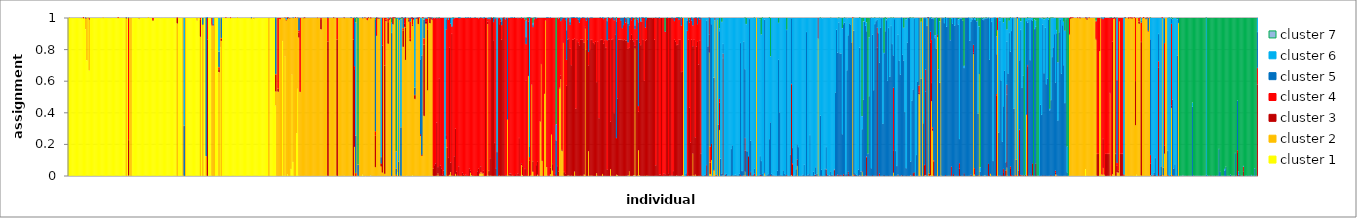
| Category | cluster 1 | cluster 2 | cluster 3 | cluster 4 | cluster 5 | cluster 6 | cluster 7 |
|---|---|---|---|---|---|---|---|
| 0 | 1 | 0 | 0 | 0 | 0 | 0 | 0 |
| 1 | 0.999 | 0.001 | 0 | 0 | 0 | 0 | 0 |
| 2 | 1 | 0 | 0 | 0 | 0 | 0 | 0 |
| 3 | 1 | 0 | 0 | 0 | 0 | 0 | 0 |
| 4 | 1 | 0 | 0 | 0 | 0 | 0 | 0 |
| 5 | 1 | 0 | 0 | 0 | 0 | 0 | 0 |
| 6 | 1 | 0 | 0 | 0 | 0 | 0 | 0 |
| 7 | 1 | 0 | 0 | 0 | 0 | 0 | 0 |
| 8 | 1 | 0 | 0 | 0 | 0 | 0 | 0 |
| 9 | 1 | 0 | 0 | 0 | 0 | 0 | 0 |
| 10 | 1 | 0 | 0 | 0 | 0 | 0 | 0 |
| 11 | 0.997 | 0.003 | 0 | 0 | 0 | 0 | 0 |
| 12 | 1 | 0 | 0 | 0 | 0 | 0 | 0 |
| 13 | 0.997 | 0.001 | 0.002 | 0 | 0 | 0 | 0 |
| 14 | 1 | 0 | 0 | 0 | 0 | 0 | 0 |
| 15 | 0.927 | 0.067 | 0 | 0.005 | 0.001 | 0 | 0 |
| 16 | 0.731 | 0.269 | 0 | 0 | 0 | 0 | 0 |
| 17 | 0.999 | 0.001 | 0 | 0 | 0 | 0 | 0 |
| 18 | 0.666 | 0.322 | 0.006 | 0.005 | 0 | 0 | 0 |
| 19 | 1 | 0 | 0 | 0 | 0 | 0 | 0 |
| 20 | 1 | 0 | 0 | 0 | 0 | 0 | 0 |
| 21 | 1 | 0 | 0 | 0 | 0 | 0 | 0 |
| 22 | 1 | 0 | 0 | 0 | 0 | 0 | 0 |
| 23 | 1 | 0 | 0 | 0 | 0 | 0 | 0 |
| 24 | 1 | 0 | 0 | 0 | 0 | 0 | 0 |
| 25 | 1 | 0 | 0 | 0 | 0 | 0 | 0 |
| 26 | 1 | 0 | 0 | 0 | 0 | 0 | 0 |
| 27 | 1 | 0 | 0 | 0 | 0 | 0 | 0 |
| 28 | 1 | 0 | 0 | 0 | 0 | 0 | 0 |
| 29 | 1 | 0 | 0 | 0 | 0 | 0 | 0 |
| 30 | 0.999 | 0.001 | 0 | 0 | 0 | 0 | 0 |
| 31 | 1 | 0 | 0 | 0 | 0 | 0 | 0 |
| 32 | 1 | 0 | 0 | 0 | 0 | 0 | 0 |
| 33 | 1 | 0 | 0 | 0 | 0 | 0 | 0 |
| 34 | 1 | 0 | 0 | 0 | 0 | 0 | 0 |
| 35 | 1 | 0 | 0 | 0 | 0 | 0 | 0 |
| 36 | 1 | 0 | 0 | 0 | 0 | 0 | 0 |
| 37 | 1 | 0 | 0 | 0 | 0 | 0 | 0 |
| 38 | 1 | 0 | 0 | 0 | 0 | 0 | 0 |
| 39 | 1 | 0 | 0 | 0 | 0 | 0 | 0 |
| 40 | 1 | 0 | 0 | 0 | 0 | 0 | 0 |
| 41 | 1 | 0 | 0 | 0 | 0 | 0 | 0 |
| 42 | 1 | 0 | 0 | 0 | 0 | 0 | 0 |
| 43 | 0.999 | 0.001 | 0 | 0 | 0 | 0 | 0 |
| 44 | 1 | 0 | 0 | 0 | 0 | 0 | 0 |
| 45 | 1 | 0 | 0 | 0 | 0 | 0 | 0 |
| 46 | 1 | 0 | 0 | 0 | 0 | 0 | 0 |
| 47 | 1 | 0 | 0 | 0 | 0 | 0 | 0 |
| 48 | 1 | 0 | 0 | 0 | 0 | 0 | 0 |
| 49 | 1 | 0 | 0 | 0 | 0 | 0 | 0 |
| 50 | 0 | 0.996 | 0.003 | 0 | 0 | 0.001 | 0 |
| 51 | 1 | 0 | 0 | 0 | 0 | 0 | 0 |
| 52 | 0 | 0.002 | 0.224 | 0.772 | 0.002 | 0 | 0 |
| 53 | 1 | 0 | 0 | 0 | 0 | 0 | 0 |
| 54 | 0 | 1 | 0 | 0 | 0 | 0 | 0 |
| 55 | 1 | 0 | 0 | 0 | 0 | 0 | 0 |
| 56 | 1 | 0 | 0 | 0 | 0 | 0 | 0 |
| 57 | 1 | 0 | 0 | 0 | 0 | 0 | 0 |
| 58 | 1 | 0 | 0 | 0 | 0 | 0 | 0 |
| 59 | 1 | 0 | 0 | 0 | 0 | 0 | 0 |
| 60 | 1 | 0 | 0 | 0 | 0 | 0 | 0 |
| 61 | 0.99 | 0.01 | 0 | 0 | 0 | 0 | 0 |
| 62 | 1 | 0 | 0 | 0 | 0 | 0 | 0 |
| 63 | 1 | 0 | 0 | 0 | 0 | 0 | 0 |
| 64 | 1 | 0 | 0 | 0 | 0 | 0 | 0 |
| 65 | 1 | 0 | 0 | 0 | 0 | 0 | 0 |
| 66 | 1 | 0 | 0 | 0 | 0 | 0 | 0 |
| 67 | 1 | 0 | 0 | 0 | 0 | 0 | 0 |
| 68 | 1 | 0 | 0 | 0 | 0 | 0 | 0 |
| 69 | 1 | 0 | 0 | 0 | 0 | 0 | 0 |
| 70 | 1 | 0 | 0 | 0 | 0 | 0 | 0 |
| 71 | 1 | 0 | 0 | 0 | 0 | 0 | 0 |
| 72 | 1 | 0 | 0 | 0 | 0 | 0 | 0 |
| 73 | 0.985 | 0 | 0 | 0.015 | 0 | 0 | 0 |
| 74 | 1 | 0 | 0 | 0 | 0 | 0 | 0 |
| 75 | 1 | 0 | 0 | 0 | 0 | 0 | 0 |
| 76 | 1 | 0 | 0 | 0 | 0 | 0 | 0 |
| 77 | 1 | 0 | 0 | 0 | 0 | 0 | 0 |
| 78 | 1 | 0 | 0 | 0 | 0 | 0 | 0 |
| 79 | 1 | 0 | 0 | 0 | 0 | 0 | 0 |
| 80 | 1 | 0 | 0 | 0 | 0 | 0 | 0 |
| 81 | 1 | 0 | 0 | 0 | 0 | 0 | 0 |
| 82 | 1 | 0 | 0 | 0 | 0 | 0 | 0 |
| 83 | 1 | 0 | 0 | 0 | 0 | 0 | 0 |
| 84 | 1 | 0 | 0 | 0 | 0 | 0 | 0 |
| 85 | 1 | 0 | 0 | 0 | 0 | 0 | 0 |
| 86 | 1 | 0 | 0 | 0 | 0 | 0 | 0 |
| 87 | 1 | 0 | 0 | 0 | 0 | 0 | 0 |
| 88 | 1 | 0 | 0 | 0 | 0 | 0 | 0 |
| 89 | 1 | 0 | 0 | 0 | 0 | 0 | 0 |
| 90 | 1 | 0 | 0 | 0 | 0 | 0 | 0 |
| 91 | 1 | 0 | 0 | 0 | 0 | 0 | 0 |
| 92 | 1 | 0 | 0 | 0 | 0 | 0 | 0 |
| 93 | 1 | 0 | 0 | 0 | 0 | 0 | 0 |
| 94 | 0 | 0.964 | 0.035 | 0.001 | 0 | 0 | 0 |
| 95 | 1 | 0 | 0 | 0 | 0 | 0 | 0 |
| 96 | 1 | 0 | 0 | 0 | 0 | 0 | 0 |
| 97 | 1 | 0 | 0 | 0 | 0 | 0 | 0 |
| 98 | 1 | 0 | 0 | 0 | 0 | 0 | 0 |
| 99 | 0 | 1 | 0 | 0 | 0 | 0 | 0 |
| 100 | 0 | 0 | 0 | 0 | 0.316 | 0.684 | 0 |
| 101 | 0 | 1 | 0 | 0 | 0 | 0 | 0 |
| 102 | 1 | 0 | 0 | 0 | 0 | 0 | 0 |
| 103 | 1 | 0 | 0 | 0 | 0 | 0 | 0 |
| 104 | 1 | 0 | 0 | 0 | 0 | 0 | 0 |
| 105 | 1 | 0 | 0 | 0 | 0 | 0 | 0 |
| 106 | 1 | 0 | 0 | 0 | 0 | 0 | 0 |
| 107 | 1 | 0 | 0 | 0 | 0 | 0 | 0 |
| 108 | 1 | 0 | 0 | 0 | 0 | 0 | 0 |
| 109 | 1 | 0 | 0 | 0 | 0 | 0 | 0 |
| 110 | 1 | 0 | 0 | 0 | 0 | 0 | 0 |
| 111 | 0.981 | 0.019 | 0 | 0 | 0 | 0 | 0 |
| 112 | 1 | 0 | 0 | 0 | 0 | 0 | 0 |
| 113 | 1 | 0 | 0 | 0 | 0 | 0 | 0 |
| 114 | 0 | 0.88 | 0.107 | 0.013 | 0 | 0 | 0 |
| 115 | 1 | 0 | 0 | 0 | 0 | 0 | 0 |
| 116 | 0 | 0.956 | 0 | 0.001 | 0.043 | 0 | 0 |
| 117 | 1 | 0 | 0 | 0 | 0 | 0 | 0 |
| 118 | 1 | 0 | 0 | 0 | 0 | 0 | 0 |
| 119 | 0 | 0.124 | 0 | 0 | 0.876 | 0 | 0 |
| 120 | 0 | 0 | 0.863 | 0.137 | 0 | 0 | 0 |
| 121 | 1 | 0 | 0 | 0 | 0 | 0 | 0 |
| 122 | 1 | 0 | 0 | 0 | 0 | 0 | 0 |
| 123 | 1 | 0 | 0 | 0 | 0 | 0 | 0 |
| 124 | 0 | 0.952 | 0.002 | 0.046 | 0 | 0 | 0 |
| 125 | 0 | 0.95 | 0.003 | 0 | 0.008 | 0.04 | 0 |
| 126 | 0 | 1 | 0 | 0 | 0 | 0 | 0 |
| 127 | 1 | 0 | 0 | 0 | 0 | 0 | 0 |
| 128 | 1 | 0 | 0 | 0 | 0 | 0 | 0 |
| 129 | 1 | 0 | 0 | 0 | 0 | 0 | 0 |
| 130 | 0 | 0.655 | 0.02 | 0.012 | 0.099 | 0.214 | 0 |
| 131 | 0.814 | 0.186 | 0 | 0 | 0 | 0 | 0 |
| 132 | 0 | 0.854 | 0.013 | 0.005 | 0.126 | 0.002 | 0 |
| 133 | 1 | 0 | 0 | 0 | 0 | 0 | 0 |
| 134 | 1 | 0 | 0 | 0 | 0 | 0 | 0 |
| 135 | 1 | 0 | 0 | 0 | 0 | 0 | 0 |
| 136 | 1 | 0 | 0 | 0 | 0 | 0 | 0 |
| 137 | 1 | 0 | 0 | 0 | 0 | 0 | 0 |
| 138 | 1 | 0 | 0 | 0 | 0 | 0 | 0 |
| 139 | 1 | 0 | 0 | 0 | 0 | 0 | 0 |
| 140 | 0.999 | 0 | 0 | 0.001 | 0 | 0 | 0 |
| 141 | 1 | 0 | 0 | 0 | 0 | 0 | 0 |
| 142 | 1 | 0 | 0 | 0 | 0 | 0 | 0 |
| 143 | 1 | 0 | 0 | 0 | 0 | 0 | 0 |
| 144 | 1 | 0 | 0 | 0 | 0 | 0 | 0 |
| 145 | 1 | 0 | 0 | 0 | 0 | 0 | 0 |
| 146 | 0.999 | 0.001 | 0 | 0 | 0 | 0 | 0 |
| 147 | 1 | 0 | 0 | 0 | 0 | 0 | 0 |
| 148 | 1 | 0 | 0 | 0 | 0 | 0 | 0 |
| 149 | 1 | 0 | 0 | 0 | 0 | 0 | 0 |
| 150 | 1 | 0 | 0 | 0 | 0 | 0 | 0 |
| 151 | 1 | 0 | 0 | 0 | 0 | 0 | 0 |
| 152 | 1 | 0 | 0 | 0 | 0 | 0 | 0 |
| 153 | 1 | 0 | 0 | 0 | 0 | 0 | 0 |
| 154 | 1 | 0 | 0 | 0 | 0 | 0 | 0 |
| 155 | 1 | 0 | 0 | 0 | 0 | 0 | 0 |
| 156 | 1 | 0 | 0 | 0 | 0 | 0 | 0 |
| 157 | 1 | 0 | 0 | 0 | 0 | 0 | 0 |
| 158 | 0.99 | 0.009 | 0 | 0 | 0.001 | 0 | 0 |
| 159 | 1 | 0 | 0 | 0 | 0 | 0 | 0 |
| 160 | 0.99 | 0.01 | 0 | 0 | 0 | 0 | 0 |
| 161 | 1 | 0 | 0 | 0 | 0 | 0 | 0 |
| 162 | 1 | 0 | 0 | 0 | 0 | 0 | 0 |
| 163 | 1 | 0 | 0 | 0 | 0 | 0 | 0 |
| 164 | 1 | 0 | 0 | 0 | 0 | 0 | 0 |
| 165 | 1 | 0 | 0 | 0 | 0 | 0 | 0 |
| 166 | 1 | 0 | 0 | 0 | 0 | 0 | 0 |
| 167 | 1 | 0 | 0 | 0 | 0 | 0 | 0 |
| 168 | 1 | 0 | 0 | 0 | 0 | 0 | 0 |
| 169 | 1 | 0 | 0 | 0 | 0 | 0 | 0 |
| 170 | 1 | 0 | 0 | 0 | 0 | 0 | 0 |
| 171 | 1 | 0 | 0 | 0 | 0 | 0 | 0 |
| 172 | 1 | 0 | 0 | 0 | 0 | 0 | 0 |
| 173 | 0 | 1 | 0 | 0 | 0 | 0 | 0 |
| 174 | 1 | 0 | 0 | 0 | 0 | 0 | 0 |
| 175 | 1 | 0 | 0 | 0 | 0 | 0 | 0 |
| 176 | 1 | 0 | 0 | 0 | 0 | 0 | 0 |
| 177 | 1 | 0 | 0 | 0 | 0 | 0 | 0 |
| 178 | 1 | 0 | 0 | 0 | 0 | 0 | 0 |
| 179 | 0.444 | 0.089 | 0.108 | 0.002 | 0.356 | 0.001 | 0 |
| 180 | 0 | 1 | 0 | 0 | 0 | 0 | 0 |
| 181 | 0 | 0.532 | 0.018 | 0.45 | 0 | 0 | 0 |
| 182 | 0 | 0.993 | 0.001 | 0.006 | 0 | 0 | 0 |
| 183 | 0 | 0.993 | 0 | 0.007 | 0 | 0 | 0 |
| 184 | 0 | 1 | 0 | 0 | 0 | 0 | 0 |
| 185 | 0.852 | 0.148 | 0 | 0 | 0 | 0 | 0 |
| 186 | 0.001 | 0.999 | 0 | 0 | 0 | 0 | 0 |
| 187 | 0.757 | 0.242 | 0.002 | 0 | 0 | 0 | 0 |
| 188 | 0 | 0.984 | 0.002 | 0.002 | 0 | 0.012 | 0 |
| 189 | 0.01 | 0.983 | 0.007 | 0 | 0 | 0 | 0 |
| 190 | 0.001 | 0.998 | 0 | 0 | 0.001 | 0 | 0 |
| 191 | 0 | 0.995 | 0 | 0.005 | 0 | 0 | 0 |
| 192 | 0.042 | 0.958 | 0 | 0 | 0 | 0 | 0 |
| 193 | 0.641 | 0.359 | 0 | 0 | 0 | 0 | 0 |
| 194 | 0.086 | 0.913 | 0 | 0 | 0.001 | 0 | 0 |
| 195 | 0 | 1 | 0 | 0 | 0 | 0 | 0 |
| 196 | 0 | 1 | 0 | 0 | 0 | 0 | 0 |
| 197 | 0.269 | 0.731 | 0 | 0 | 0 | 0 | 0 |
| 198 | 0.55 | 0.448 | 0 | 0.002 | 0 | 0 | 0 |
| 199 | 0.001 | 0.874 | 0.032 | 0.012 | 0.079 | 0.002 | 0 |
| 200 | 0 | 0.531 | 0.001 | 0.468 | 0 | 0 | 0 |
| 201 | 0 | 1 | 0 | 0 | 0 | 0 | 0 |
| 202 | 0 | 1 | 0 | 0 | 0 | 0 | 0 |
| 203 | 0 | 0.997 | 0 | 0.003 | 0 | 0 | 0 |
| 204 | 0 | 0.999 | 0.001 | 0 | 0 | 0 | 0 |
| 205 | 0 | 1 | 0 | 0 | 0 | 0 | 0 |
| 206 | 0 | 1 | 0 | 0 | 0 | 0 | 0 |
| 207 | 0 | 1 | 0 | 0 | 0 | 0 | 0 |
| 208 | 0 | 1 | 0 | 0 | 0 | 0 | 0 |
| 209 | 0 | 1 | 0 | 0 | 0 | 0 | 0 |
| 210 | 0 | 1 | 0 | 0 | 0 | 0 | 0 |
| 211 | 0 | 1 | 0 | 0 | 0 | 0 | 0 |
| 212 | 0 | 1 | 0 | 0 | 0 | 0 | 0 |
| 213 | 0 | 1 | 0 | 0 | 0 | 0 | 0 |
| 214 | 0 | 1 | 0 | 0 | 0 | 0 | 0 |
| 215 | 0 | 0.998 | 0 | 0.002 | 0 | 0 | 0 |
| 216 | 0 | 1 | 0 | 0 | 0 | 0 | 0 |
| 217 | 0 | 1 | 0 | 0 | 0 | 0 | 0 |
| 218 | 0 | 0.926 | 0.066 | 0.008 | 0 | 0 | 0 |
| 219 | 0 | 1 | 0 | 0 | 0 | 0 | 0 |
| 220 | 0 | 1 | 0 | 0 | 0 | 0 | 0 |
| 221 | 0 | 1 | 0 | 0 | 0 | 0 | 0 |
| 222 | 0 | 1 | 0 | 0 | 0 | 0 | 0 |
| 223 | 0 | 1 | 0 | 0 | 0 | 0 | 0 |
| 224 | 0 | 0 | 0.851 | 0.148 | 0.001 | 0 | 0 |
| 225 | 0 | 1 | 0 | 0 | 0 | 0 | 0 |
| 226 | 0 | 1 | 0 | 0 | 0 | 0 | 0 |
| 227 | 0 | 1 | 0 | 0 | 0 | 0 | 0 |
| 228 | 0 | 1 | 0 | 0 | 0 | 0 | 0 |
| 229 | 0 | 0.999 | 0.001 | 0 | 0 | 0 | 0 |
| 230 | 0 | 1 | 0 | 0 | 0 | 0 | 0 |
| 231 | 0 | 1 | 0 | 0 | 0 | 0 | 0 |
| 232 | 0 | 0 | 0.862 | 0.138 | 0 | 0 | 0 |
| 233 | 0 | 1 | 0 | 0 | 0 | 0 | 0 |
| 234 | 0.001 | 0.999 | 0 | 0 | 0 | 0 | 0 |
| 235 | 0 | 1 | 0 | 0 | 0 | 0 | 0 |
| 236 | 0 | 1 | 0 | 0 | 0 | 0 | 0 |
| 237 | 0 | 1 | 0 | 0 | 0 | 0 | 0 |
| 238 | 0.002 | 0.997 | 0.001 | 0 | 0 | 0 | 0 |
| 239 | 0 | 1 | 0 | 0 | 0 | 0 | 0 |
| 240 | 0 | 1 | 0 | 0 | 0 | 0 | 0 |
| 241 | 0 | 1 | 0 | 0 | 0 | 0 | 0 |
| 242 | 0 | 1 | 0 | 0 | 0 | 0 | 0 |
| 243 | 0 | 1 | 0 | 0 | 0 | 0 | 0 |
| 244 | 0 | 1 | 0 | 0 | 0 | 0 | 0 |
| 245 | 0 | 1 | 0 | 0 | 0 | 0 | 0 |
| 246 | 0 | 0 | 0.861 | 0.139 | 0 | 0 | 0 |
| 247 | 0 | 0.183 | 0.492 | 0.019 | 0.304 | 0 | 0.002 |
| 248 | 0 | 0 | 0.001 | 0.016 | 0.237 | 0.715 | 0.031 |
| 249 | 0 | 1 | 0 | 0 | 0 | 0 | 0 |
| 250 | 0 | 0 | 0 | 0 | 0.07 | 0 | 0.93 |
| 251 | 0 | 1 | 0 | 0 | 0 | 0 | 0 |
| 252 | 0 | 1 | 0 | 0 | 0 | 0 | 0 |
| 253 | 0 | 1 | 0 | 0 | 0 | 0 | 0 |
| 254 | 0.006 | 0.99 | 0 | 0.003 | 0.001 | 0 | 0 |
| 255 | 0 | 1 | 0 | 0 | 0 | 0 | 0 |
| 256 | 0 | 0.999 | 0.001 | 0 | 0 | 0 | 0 |
| 257 | 0 | 1 | 0 | 0 | 0 | 0 | 0 |
| 258 | 0 | 0.985 | 0 | 0.015 | 0 | 0 | 0 |
| 259 | 0 | 0.999 | 0.001 | 0 | 0 | 0 | 0 |
| 260 | 0 | 1 | 0 | 0 | 0 | 0 | 0 |
| 261 | 0.003 | 0.994 | 0.002 | 0.001 | 0 | 0 | 0 |
| 262 | 0 | 1 | 0 | 0 | 0 | 0 | 0 |
| 263 | 0 | 1 | 0 | 0 | 0 | 0 | 0 |
| 264 | 0 | 1 | 0 | 0 | 0 | 0 | 0 |
| 265 | 0 | 0.054 | 0.202 | 0.026 | 0.71 | 0 | 0.008 |
| 266 | 0 | 0.888 | 0.001 | 0.111 | 0 | 0 | 0 |
| 267 | 0 | 0.997 | 0.001 | 0.002 | 0 | 0 | 0 |
| 268 | 0 | 0.996 | 0 | 0 | 0.004 | 0 | 0 |
| 269 | 0 | 1 | 0 | 0 | 0 | 0 | 0 |
| 270 | 0 | 0.058 | 0.018 | 0 | 0.041 | 0.882 | 0 |
| 271 | 0 | 0.02 | 0.804 | 0.176 | 0 | 0 | 0 |
| 272 | 0 | 1 | 0 | 0 | 0 | 0 | 0 |
| 273 | 0 | 0.013 | 0.685 | 0.302 | 0 | 0 | 0 |
| 274 | 0 | 0.978 | 0.01 | 0.012 | 0 | 0 | 0 |
| 275 | 0 | 1 | 0 | 0 | 0 | 0 | 0 |
| 276 | 0 | 0.836 | 0.137 | 0.022 | 0.004 | 0.001 | 0 |
| 277 | 0 | 0.987 | 0.01 | 0.003 | 0 | 0 | 0 |
| 278 | 0 | 0.996 | 0.002 | 0.002 | 0 | 0 | 0 |
| 279 | 0 | 0 | 0 | 0 | 0.904 | 0.064 | 0.032 |
| 280 | 0 | 0.958 | 0.041 | 0.001 | 0 | 0 | 0 |
| 281 | 0 | 0.998 | 0.002 | 0 | 0 | 0 | 0 |
| 282 | 0 | 0.998 | 0 | 0.001 | 0.001 | 0 | 0 |
| 283 | 0 | 0 | 0 | 0.005 | 0.041 | 0.107 | 0.847 |
| 284 | 0.021 | 0.974 | 0 | 0 | 0.005 | 0 | 0 |
| 285 | 0 | 0 | 0 | 0.001 | 0.088 | 0.911 | 0 |
| 286 | 0 | 0.986 | 0.003 | 0 | 0.011 | 0 | 0 |
| 287 | 0 | 0 | 0 | 0 | 0.306 | 0.685 | 0.009 |
| 288 | 0 | 1 | 0 | 0 | 0 | 0 | 0 |
| 289 | 0 | 0.816 | 0.105 | 0.014 | 0.066 | 0 | 0 |
| 290 | 0 | 0.943 | 0.019 | 0.036 | 0.002 | 0 | 0 |
| 291 | 0 | 0.733 | 0.205 | 0.061 | 0 | 0 | 0 |
| 292 | 0.001 | 0.996 | 0 | 0 | 0.003 | 0 | 0 |
| 293 | 0 | 1 | 0 | 0 | 0 | 0 | 0 |
| 294 | 0 | 0.974 | 0.017 | 0.009 | 0 | 0 | 0 |
| 295 | 0 | 0.851 | 0.015 | 0.11 | 0.024 | 0 | 0 |
| 296 | 0 | 0.994 | 0.005 | 0.001 | 0 | 0 | 0 |
| 297 | 0.004 | 0.945 | 0.007 | 0.044 | 0 | 0 | 0 |
| 298 | 0 | 0.988 | 0.012 | 0 | 0 | 0 | 0 |
| 299 | 0 | 0.486 | 0.024 | 0.001 | 0.046 | 0.442 | 0 |
| 300 | 0 | 0.994 | 0.002 | 0 | 0.004 | 0 | 0 |
| 301 | 0 | 0.995 | 0.001 | 0.003 | 0.001 | 0 | 0 |
| 302 | 0 | 0.96 | 0.04 | 0.001 | 0 | 0 | 0 |
| 303 | 0 | 0.999 | 0 | 0.001 | 0 | 0 | 0 |
| 304 | 0 | 0.252 | 0.01 | 0 | 0.474 | 0.263 | 0 |
| 305 | 0 | 0.126 | 0.006 | 0 | 0.629 | 0.233 | 0.005 |
| 306 | 0 | 0.999 | 0.001 | 0 | 0 | 0 | 0 |
| 307 | 0 | 0.378 | 0.45 | 0.041 | 0.117 | 0.013 | 0 |
| 308 | 0 | 0.963 | 0.015 | 0.017 | 0.004 | 0 | 0 |
| 309 | 0 | 0.963 | 0.015 | 0.017 | 0.004 | 0 | 0 |
| 310 | 0 | 0.541 | 0.387 | 0.066 | 0.005 | 0.001 | 0 |
| 311 | 0 | 1 | 0 | 0 | 0 | 0 | 0 |
| 312 | 0 | 0.965 | 0.032 | 0.003 | 0 | 0 | 0 |
| 313 | 0 | 0.992 | 0.008 | 0.001 | 0 | 0 | 0 |
| 314 | 0 | 0.986 | 0.007 | 0.003 | 0.004 | 0 | 0 |
| 315 | 0 | 0 | 0.046 | 0.954 | 0 | 0 | 0 |
| 316 | 0 | 0 | 0.067 | 0.93 | 0 | 0 | 0.004 |
| 317 | 0 | 0 | 0.078 | 0.922 | 0 | 0 | 0 |
| 318 | 0 | 0.001 | 0.336 | 0.66 | 0.001 | 0 | 0.002 |
| 319 | 0 | 0.015 | 0.04 | 0.945 | 0 | 0 | 0 |
| 320 | 0 | 0 | 0.617 | 0.381 | 0.001 | 0 | 0.001 |
| 321 | 0 | 0 | 0.064 | 0.936 | 0 | 0 | 0 |
| 322 | 0 | 0 | 0.046 | 0.954 | 0 | 0 | 0 |
| 323 | 0 | 0 | 0.009 | 0.991 | 0 | 0 | 0 |
| 324 | 0 | 0 | 0.034 | 0.966 | 0 | 0 | 0 |
| 325 | 0 | 0 | 0 | 0 | 0.001 | 0.999 | 0 |
| 326 | 0 | 0.231 | 0.026 | 0.668 | 0.064 | 0.01 | 0 |
| 327 | 0 | 0 | 0.178 | 0.822 | 0 | 0 | 0 |
| 328 | 0 | 0.001 | 0.112 | 0.874 | 0 | 0.013 | 0 |
| 329 | 0 | 0.007 | 0.806 | 0.188 | 0 | 0 | 0 |
| 330 | 0 | 0.022 | 0.061 | 0.88 | 0.037 | 0 | 0 |
| 331 | 0 | 0.001 | 0.897 | 0.044 | 0.006 | 0.052 | 0 |
| 332 | 0 | 0.002 | 0.002 | 0.988 | 0.008 | 0 | 0 |
| 333 | 0 | 0 | 0.123 | 0.874 | 0 | 0.003 | 0 |
| 334 | 0 | 0.012 | 0.287 | 0.701 | 0 | 0 | 0 |
| 335 | 0 | 0.001 | 0.026 | 0.973 | 0 | 0 | 0 |
| 336 | 0 | 0 | 0.005 | 0.995 | 0 | 0 | 0 |
| 337 | 0 | 0 | 0.06 | 0.939 | 0 | 0.001 | 0 |
| 338 | 0.001 | 0 | 0 | 0.997 | 0.002 | 0 | 0 |
| 339 | 0 | 0.001 | 0 | 0.999 | 0 | 0 | 0 |
| 340 | 0 | 0 | 0.019 | 0.981 | 0 | 0 | 0 |
| 341 | 0 | 0 | 0.008 | 0.992 | 0 | 0 | 0 |
| 342 | 0 | 0 | 0 | 0.999 | 0 | 0 | 0 |
| 343 | 0 | 0 | 0.006 | 0.992 | 0.001 | 0 | 0 |
| 344 | 0 | 0 | 0.002 | 0.998 | 0 | 0 | 0 |
| 345 | 0 | 0 | 0.001 | 0.999 | 0 | 0 | 0 |
| 346 | 0 | 0 | 0.045 | 0.955 | 0 | 0 | 0 |
| 347 | 0 | 0.02 | 0.012 | 0.968 | 0.001 | 0 | 0 |
| 348 | 0 | 0.003 | 0.008 | 0.989 | 0 | 0 | 0 |
| 349 | 0 | 0.002 | 0.001 | 0.997 | 0 | 0 | 0 |
| 350 | 0 | 0 | 0 | 1 | 0 | 0 | 0 |
| 351 | 0 | 0 | 0.001 | 0.998 | 0 | 0 | 0 |
| 352 | 0 | 0 | 0 | 1 | 0 | 0 | 0 |
| 353 | 0 | 0 | 0.028 | 0.972 | 0 | 0 | 0 |
| 354 | 0 | 0 | 0.045 | 0.952 | 0 | 0.004 | 0 |
| 355 | 0 | 0.013 | 0 | 0.987 | 0 | 0 | 0 |
| 356 | 0.006 | 0.017 | 0.037 | 0.94 | 0 | 0 | 0 |
| 357 | 0 | 0.014 | 0.004 | 0.981 | 0 | 0 | 0 |
| 358 | 0 | 0.016 | 0.016 | 0.963 | 0.002 | 0.002 | 0 |
| 359 | 0 | 0 | 0.001 | 0.998 | 0.001 | 0 | 0 |
| 360 | 0 | 0 | 1 | 0 | 0 | 0 | 0 |
| 361 | 0 | 0 | 0 | 1 | 0 | 0 | 0 |
| 362 | 0.005 | 0.954 | 0.018 | 0.016 | 0.008 | 0 | 0 |
| 363 | 0 | 0 | 0.031 | 0.965 | 0.003 | 0.001 | 0 |
| 364 | 0 | 0.002 | 0.109 | 0.88 | 0.008 | 0.001 | 0 |
| 365 | 0 | 0.001 | 0.998 | 0.001 | 0 | 0 | 0 |
| 366 | 0 | 0 | 1 | 0 | 0 | 0 | 0 |
| 367 | 0 | 0 | 0.858 | 0.115 | 0.026 | 0 | 0 |
| 368 | 0 | 0 | 0.208 | 0.784 | 0.007 | 0.001 | 0 |
| 369 | 0 | 0 | 0.048 | 0.95 | 0 | 0.002 | 0 |
| 370 | 0 | 0 | 0 | 0 | 0.15 | 0.85 | 0 |
| 371 | 0 | 0 | 0.995 | 0.005 | 0 | 0 | 0 |
| 372 | 0 | 0.002 | 0.958 | 0.04 | 0 | 0 | 0 |
| 373 | 0 | 0 | 0.977 | 0.015 | 0.001 | 0.008 | 0 |
| 374 | 0 | 0 | 0.862 | 0.092 | 0.024 | 0.022 | 0 |
| 375 | 0 | 0 | 1 | 0 | 0 | 0 | 0 |
| 376 | 0 | 0 | 1 | 0 | 0 | 0 | 0 |
| 377 | 0 | 0 | 0.002 | 0.989 | 0 | 0.009 | 0 |
| 378 | 0 | 0 | 0.004 | 0.996 | 0 | 0 | 0 |
| 379 | 0 | 0.356 | 0 | 0 | 0.641 | 0.003 | 0 |
| 380 | 0 | 0.001 | 0.002 | 0.997 | 0 | 0 | 0 |
| 381 | 0 | 0.001 | 0.014 | 0.985 | 0 | 0 | 0 |
| 382 | 0 | 0 | 0.014 | 0.986 | 0 | 0 | 0 |
| 383 | 0 | 0.002 | 0 | 0.998 | 0 | 0 | 0 |
| 384 | 0 | 0 | 0 | 1 | 0 | 0 | 0 |
| 385 | 0 | 0 | 0.001 | 0.999 | 0 | 0 | 0 |
| 386 | 0 | 0 | 0.01 | 0.99 | 0 | 0 | 0 |
| 387 | 0 | 0 | 0 | 1 | 0 | 0 | 0 |
| 388 | 0 | 0 | 0.015 | 0.983 | 0.003 | 0 | 0 |
| 389 | 0 | 0 | 0.239 | 0.761 | 0 | 0 | 0 |
| 390 | 0 | 0 | 0 | 1 | 0 | 0 | 0 |
| 391 | 0.006 | 0.062 | 0.011 | 0.918 | 0.002 | 0 | 0.001 |
| 392 | 0 | 0.004 | 0.056 | 0.94 | 0 | 0 | 0 |
| 393 | 0 | 0 | 0 | 1 | 0 | 0 | 0 |
| 394 | 0 | 0 | 0.043 | 0.947 | 0.006 | 0.001 | 0.003 |
| 395 | 0 | 0.001 | 0.601 | 0.232 | 0.043 | 0.106 | 0.017 |
| 396 | 0 | 0 | 0 | 0.999 | 0 | 0 | 0.001 |
| 397 | 0 | 0.631 | 0.343 | 0.025 | 0 | 0 | 0 |
| 398 | 0 | 0 | 0.096 | 0.022 | 0.068 | 0.814 | 0 |
| 399 | 0 | 0.001 | 0.003 | 0.995 | 0.001 | 0 | 0 |
| 400 | 0 | 0.575 | 0.002 | 0.423 | 0 | 0 | 0 |
| 401 | 0.025 | 0 | 0.067 | 0.85 | 0.012 | 0.013 | 0.033 |
| 402 | 0 | 0 | 0.001 | 0.99 | 0.007 | 0.001 | 0.001 |
| 403 | 0 | 0 | 0.004 | 0.995 | 0.001 | 0 | 0 |
| 404 | 0 | 0 | 0.068 | 0.929 | 0.001 | 0.003 | 0 |
| 405 | 0 | 0.007 | 0.082 | 0.912 | 0 | 0 | 0 |
| 406 | 0 | 0 | 0.001 | 0.999 | 0 | 0 | 0 |
| 407 | 0 | 0.343 | 0 | 0.657 | 0 | 0 | 0 |
| 408 | 0 | 0.708 | 0.001 | 0.291 | 0 | 0 | 0 |
| 409 | 0 | 0.097 | 0 | 0.903 | 0 | 0 | 0 |
| 410 | 0 | 0 | 0.001 | 0.999 | 0 | 0 | 0 |
| 411 | 0 | 0.518 | 0 | 0.482 | 0 | 0 | 0 |
| 412 | 0 | 0.982 | 0 | 0.018 | 0 | 0 | 0 |
| 413 | 0 | 0.053 | 0 | 0.947 | 0 | 0 | 0 |
| 414 | 0 | 0 | 0 | 1 | 0 | 0 | 0 |
| 415 | 0 | 0 | 0.004 | 0.996 | 0 | 0 | 0 |
| 416 | 0 | 0.009 | 0.043 | 0.947 | 0.001 | 0 | 0 |
| 417 | 0 | 0.261 | 0 | 0.739 | 0 | 0 | 0 |
| 418 | 0 | 0.032 | 0.042 | 0.926 | 0 | 0 | 0 |
| 419 | 0 | 0 | 0 | 1 | 0 | 0 | 0 |
| 420 | 0 | 0 | 0.017 | 0.983 | 0 | 0 | 0 |
| 421 | 0 | 0 | 0.002 | 0 | 0.221 | 0.102 | 0.674 |
| 422 | 0 | 0 | 0.061 | 0.939 | 0 | 0 | 0 |
| 423 | 0 | 0 | 0.026 | 0.966 | 0.005 | 0 | 0.003 |
| 424 | 0 | 0.553 | 0.006 | 0.441 | 0 | 0 | 0 |
| 425 | 0 | 0.61 | 0.023 | 0.346 | 0.02 | 0 | 0.001 |
| 426 | 0 | 0.157 | 0.006 | 0.829 | 0.008 | 0 | 0 |
| 427 | 0 | 0.842 | 0.001 | 0.157 | 0 | 0 | 0 |
| 428 | 0 | 0 | 0.023 | 0.976 | 0 | 0 | 0 |
| 429 | 0 | 0 | 0.012 | 0.973 | 0.015 | 0 | 0 |
| 430 | 0 | 0 | 0.57 | 0.163 | 0.188 | 0.078 | 0 |
| 431 | 0 | 0.002 | 0.859 | 0.137 | 0.002 | 0 | 0 |
| 432 | 0 | 0.002 | 0.864 | 0.134 | 0 | 0 | 0 |
| 433 | 0 | 0 | 0.805 | 0.15 | 0.017 | 0.028 | 0 |
| 434 | 0 | 0.002 | 0.698 | 0.299 | 0.001 | 0 | 0 |
| 435 | 0 | 0 | 0.861 | 0.138 | 0 | 0 | 0 |
| 436 | 0 | 0 | 0.862 | 0.138 | 0 | 0 | 0 |
| 437 | 0 | 0.027 | 0.84 | 0.133 | 0 | 0 | 0 |
| 438 | 0 | 0 | 0.424 | 0.576 | 0 | 0 | 0 |
| 439 | 0 | 0 | 0.86 | 0.139 | 0 | 0 | 0 |
| 440 | 0 | 0 | 0.844 | 0.144 | 0.012 | 0 | 0 |
| 441 | 0 | 0 | 0.826 | 0.144 | 0.03 | 0.001 | 0 |
| 442 | 0 | 0.001 | 0.861 | 0.13 | 0.008 | 0 | 0 |
| 443 | 0 | 0 | 0.864 | 0.136 | 0 | 0 | 0 |
| 444 | 0 | 0 | 0.861 | 0.138 | 0 | 0 | 0 |
| 445 | 0 | 0.008 | 0.835 | 0.157 | 0.001 | 0 | 0 |
| 446 | 0 | 0.932 | 0.01 | 0.058 | 0 | 0 | 0 |
| 447 | 0 | 0 | 0.797 | 0.185 | 0.018 | 0 | 0 |
| 448 | 0 | 0 | 0.861 | 0.138 | 0.002 | 0 | 0 |
| 449 | 0 | 0.155 | 0.544 | 0.085 | 0.216 | 0 | 0 |
| 450 | 0 | 0.001 | 0.796 | 0.204 | 0 | 0 | 0 |
| 451 | 0 | 0.001 | 0.859 | 0.139 | 0.001 | 0 | 0 |
| 452 | 0 | 0.002 | 0.858 | 0.139 | 0.001 | 0 | 0 |
| 453 | 0 | 0 | 0.842 | 0.158 | 0 | 0 | 0 |
| 454 | 0 | 0 | 0.834 | 0.166 | 0 | 0 | 0 |
| 455 | 0 | 0 | 0.848 | 0.152 | 0 | 0 | 0 |
| 456 | 0 | 0.015 | 0.578 | 0.407 | 0 | 0 | 0 |
| 457 | 0 | 0 | 0.85 | 0.15 | 0 | 0 | 0 |
| 458 | 0 | 0 | 0.364 | 0.636 | 0 | 0 | 0 |
| 459 | 0 | 0 | 0.86 | 0.14 | 0 | 0 | 0 |
| 460 | 0 | 0 | 0.861 | 0.139 | 0 | 0 | 0 |
| 461 | 0 | 0.011 | 0.849 | 0.139 | 0.001 | 0 | 0 |
| 462 | 0 | 0 | 0.835 | 0.157 | 0.007 | 0.001 | 0 |
| 463 | 0 | 0 | 0.858 | 0.142 | 0 | 0 | 0 |
| 464 | 0 | 0 | 0.811 | 0.189 | 0 | 0 | 0 |
| 465 | 0 | 0 | 0.038 | 0.819 | 0.121 | 0.018 | 0.003 |
| 466 | 0 | 0 | 0.861 | 0.138 | 0 | 0 | 0 |
| 467 | 0 | 0 | 0.863 | 0.137 | 0 | 0 | 0 |
| 468 | 0 | 0.042 | 0.302 | 0.651 | 0.005 | 0 | 0 |
| 469 | 0 | 0 | 0.861 | 0.139 | 0 | 0 | 0 |
| 470 | 0 | 0 | 0.866 | 0.134 | 0 | 0 | 0 |
| 471 | 0 | 0 | 0.396 | 0.588 | 0.014 | 0.002 | 0 |
| 472 | 0 | 0 | 0.896 | 0.104 | 0 | 0 | 0 |
| 473 | 0 | 0.007 | 0.231 | 0.001 | 0.738 | 0.023 | 0 |
| 474 | 0 | 0.004 | 0.486 | 0.511 | 0 | 0 | 0 |
| 475 | 0 | 0 | 0.861 | 0.139 | 0 | 0 | 0 |
| 476 | 0 | 0 | 0.863 | 0.137 | 0 | 0 | 0 |
| 477 | 0 | 0 | 0.861 | 0.12 | 0.019 | 0 | 0 |
| 478 | 0 | 0 | 0.86 | 0.075 | 0.066 | 0 | 0 |
| 479 | 0 | 0 | 0.858 | 0.096 | 0.046 | 0 | 0 |
| 480 | 0 | 0 | 0.861 | 0.138 | 0 | 0 | 0 |
| 481 | 0 | 0 | 0.857 | 0.112 | 0.03 | 0 | 0 |
| 482 | 0 | 0 | 0.856 | 0.14 | 0.005 | 0 | 0 |
| 483 | 0 | 0.003 | 0.8 | 0.041 | 0.117 | 0.037 | 0.001 |
| 484 | 0 | 0.029 | 0.784 | 0.14 | 0.048 | 0 | 0 |
| 485 | 0 | 0 | 0.861 | 0.139 | 0 | 0 | 0 |
| 486 | 0 | 0 | 0.892 | 0.092 | 0.015 | 0 | 0 |
| 487 | 0 | 0 | 0.862 | 0.137 | 0.001 | 0 | 0 |
| 488 | 0 | 0.003 | 0.848 | 0.149 | 0 | 0 | 0 |
| 489 | 0.806 | 0 | 0.017 | 0.107 | 0.022 | 0.036 | 0.013 |
| 490 | 0 | 0 | 0.862 | 0.138 | 0.001 | 0 | 0 |
| 491 | 0 | 0.002 | 0.861 | 0.124 | 0.012 | 0 | 0 |
| 492 | 0 | 0.161 | 0.245 | 0.036 | 0.53 | 0.028 | 0 |
| 493 | 0 | 0.003 | 0.84 | 0.156 | 0.001 | 0 | 0 |
| 494 | 0 | 0 | 0.827 | 0.15 | 0.001 | 0.022 | 0 |
| 495 | 0 | 0 | 0.977 | 0.022 | 0 | 0 | 0 |
| 496 | 0 | 0 | 0.862 | 0.138 | 0 | 0 | 0 |
| 497 | 0 | 0.001 | 0.6 | 0.399 | 0 | 0 | 0 |
| 498 | 0 | 0 | 0.856 | 0.083 | 0.062 | 0 | 0 |
| 499 | 0 | 0.002 | 0.86 | 0.124 | 0.013 | 0 | 0.002 |
| 500 | 0 | 0.001 | 0.999 | 0 | 0 | 0 | 0 |
| 501 | 0 | 0 | 1 | 0 | 0 | 0 | 0 |
| 502 | 0 | 0 | 1 | 0 | 0 | 0 | 0 |
| 503 | 0 | 0 | 1 | 0 | 0 | 0 | 0 |
| 504 | 0 | 0 | 0.996 | 0.004 | 0 | 0 | 0 |
| 505 | 0 | 0 | 1 | 0 | 0 | 0 | 0 |
| 506 | 0 | 0 | 0.862 | 0.138 | 0 | 0 | 0 |
| 507 | 0 | 0 | 0.066 | 0.932 | 0.001 | 0 | 0 |
| 508 | 0 | 0 | 1 | 0 | 0 | 0 | 0 |
| 509 | 0 | 0 | 1 | 0 | 0 | 0 | 0 |
| 510 | 0 | 0 | 0.008 | 0.99 | 0.001 | 0.001 | 0 |
| 511 | 0 | 0 | 0.007 | 0.993 | 0 | 0 | 0 |
| 512 | 0 | 0 | 1 | 0 | 0 | 0 | 0 |
| 513 | 0 | 0 | 0 | 1 | 0 | 0 | 0 |
| 514 | 0 | 0 | 0.015 | 0.985 | 0 | 0 | 0 |
| 515 | 0 | 0 | 0.01 | 0.903 | 0.001 | 0 | 0.087 |
| 516 | 0 | 0 | 1 | 0 | 0 | 0 | 0 |
| 517 | 0 | 0 | 0.999 | 0 | 0 | 0.001 | 0 |
| 518 | 0 | 0 | 0.016 | 0.984 | 0 | 0 | 0 |
| 519 | 0 | 0.001 | 0.999 | 0 | 0 | 0 | 0 |
| 520 | 0 | 0 | 1 | 0 | 0 | 0 | 0 |
| 521 | 0 | 0 | 0.004 | 0.994 | 0 | 0.002 | 0 |
| 522 | 0 | 0 | 0.03 | 0.97 | 0 | 0 | 0 |
| 523 | 0 | 0 | 0.863 | 0.117 | 0.02 | 0 | 0 |
| 524 | 0 | 0 | 0.849 | 0.151 | 0 | 0 | 0 |
| 525 | 0 | 0.002 | 0.825 | 0.172 | 0.001 | 0 | 0 |
| 526 | 0 | 0 | 0.829 | 0.171 | 0 | 0 | 0 |
| 527 | 0 | 0 | 0.861 | 0.126 | 0.013 | 0 | 0 |
| 528 | 0 | 0 | 0.861 | 0.139 | 0 | 0 | 0 |
| 529 | 0 | 0.001 | 0.656 | 0.294 | 0.048 | 0.001 | 0.001 |
| 530 | 0 | 0.004 | 0.657 | 0.339 | 0 | 0 | 0 |
| 531 | 0 | 1 | 0 | 0 | 0 | 0 | 0 |
| 532 | 0 | 0 | 0 | 0 | 0 | 1 | 0 |
| 533 | 0 | 0 | 0 | 0 | 0.015 | 0.985 | 0 |
| 534 | 0 | 0 | 0.001 | 0.917 | 0.065 | 0.014 | 0.003 |
| 535 | 0 | 0.001 | 0.861 | 0.138 | 0 | 0 | 0 |
| 536 | 0 | 0 | 0.431 | 0.54 | 0.017 | 0.001 | 0.012 |
| 537 | 0 | 0 | 0.21 | 0.79 | 0 | 0 | 0 |
| 538 | 0 | 0 | 0.861 | 0.12 | 0.018 | 0 | 0 |
| 539 | 0 | 0.141 | 0.679 | 0.132 | 0.044 | 0.004 | 0 |
| 540 | 0 | 0.001 | 0.861 | 0.138 | 0 | 0 | 0 |
| 541 | 0 | 0.008 | 0.234 | 0.756 | 0.001 | 0 | 0 |
| 542 | 0 | 0 | 0.818 | 0.181 | 0.001 | 0 | 0 |
| 543 | 0 | 0 | 0.851 | 0.108 | 0.04 | 0 | 0 |
| 544 | 0 | 0 | 0.705 | 0.294 | 0 | 0.001 | 0 |
| 545 | 0 | 0 | 0.858 | 0.13 | 0.012 | 0 | 0 |
| 546 | 0 | 0 | 0.139 | 0.861 | 0 | 0 | 0 |
| 547 | 0 | 0 | 0 | 0 | 0.001 | 0.999 | 0 |
| 548 | 0 | 0 | 0 | 0 | 0 | 1 | 0 |
| 549 | 0 | 0 | 0 | 0 | 0.005 | 0.995 | 0 |
| 550 | 0 | 0 | 0 | 0 | 0.009 | 0.991 | 0 |
| 551 | 0 | 0 | 0.067 | 0 | 0.915 | 0.017 | 0 |
| 552 | 0 | 0 | 0 | 0 | 0.818 | 0.182 | 0 |
| 553 | 0 | 0.78 | 0.115 | 0.104 | 0.001 | 0 | 0 |
| 554 | 0 | 0.011 | 0.072 | 0.102 | 0.816 | 0 | 0 |
| 555 | 0 | 0.1 | 0.103 | 0 | 0.757 | 0.041 | 0 |
| 556 | 0 | 0 | 0 | 0 | 0 | 1 | 0 |
| 557 | 0 | 0.033 | 0.003 | 0 | 0.584 | 0.379 | 0 |
| 558 | 0 | 0.982 | 0.003 | 0.016 | 0 | 0 | 0 |
| 559 | 0 | 0 | 0.001 | 0 | 0.004 | 0.995 | 0 |
| 560 | 0 | 0.988 | 0 | 0 | 0.005 | 0.007 | 0 |
| 561 | 0 | 0 | 0 | 0 | 0.324 | 0.676 | 0 |
| 562 | 0 | 0.29 | 0.172 | 0.024 | 0.428 | 0.017 | 0.068 |
| 563 | 0 | 0 | 0 | 0 | 0.108 | 0.892 | 0 |
| 564 | 0 | 0 | 0 | 0 | 0.012 | 0.962 | 0.026 |
| 565 | 0 | 0.003 | 0.742 | 0.029 | 0.061 | 0.165 | 0 |
| 566 | 0 | 0 | 0 | 0 | 0 | 1 | 0 |
| 567 | 0 | 0 | 0.001 | 0.004 | 0.006 | 0.989 | 0 |
| 568 | 0 | 0 | 0 | 0 | 0.015 | 0.985 | 0 |
| 569 | 0 | 0 | 0 | 0 | 0 | 1 | 0 |
| 570 | 0 | 0 | 0 | 0 | 0.004 | 0.996 | 0 |
| 571 | 0 | 0 | 0 | 0 | 0 | 1 | 0 |
| 572 | 0 | 0 | 0.001 | 0 | 0.169 | 0.83 | 0 |
| 573 | 0 | 0.001 | 0 | 0 | 0.192 | 0.807 | 0 |
| 574 | 0 | 0 | 0 | 0 | 0.001 | 0.999 | 0 |
| 575 | 0 | 0 | 0 | 0 | 0.005 | 0.995 | 0 |
| 576 | 0 | 0 | 0 | 0 | 0.006 | 0.994 | 0 |
| 577 | 0 | 0 | 0 | 0 | 0.001 | 0.999 | 0 |
| 578 | 0 | 0 | 0 | 0 | 0.002 | 0.998 | 0 |
| 579 | 0 | 0 | 0 | 0 | 0.014 | 0.986 | 0 |
| 580 | 0 | 0 | 0.004 | 0 | 0.836 | 0.16 | 0 |
| 581 | 0 | 0 | 0 | 0 | 0.03 | 0.97 | 0 |
| 582 | 0 | 0 | 0 | 0 | 0.03 | 0.97 | 0 |
| 583 | 0 | 0 | 0.003 | 0 | 0.848 | 0.15 | 0 |
| 584 | 0 | 0.026 | 0.135 | 0.078 | 0.435 | 0.325 | 0.001 |
| 585 | 0 | 0 | 0 | 0 | 0.156 | 0.804 | 0.04 |
| 586 | 0 | 0 | 0 | 0 | 0.155 | 0.845 | 0 |
| 587 | 0 | 0 | 0.122 | 0.001 | 0.002 | 0.875 | 0 |
| 588 | 0 | 0 | 0 | 0 | 0.992 | 0.008 | 0 |
| 589 | 0 | 0.001 | 0.022 | 0.001 | 0.198 | 0.778 | 0 |
| 590 | 0 | 0 | 0 | 0 | 0.001 | 0.999 | 0 |
| 591 | 0 | 0 | 0.001 | 0.001 | 0 | 0.998 | 0 |
| 592 | 0 | 0 | 0 | 0.013 | 0.031 | 0.955 | 0.001 |
| 593 | 0 | 0 | 0 | 0 | 0.001 | 0.999 | 0 |
| 594 | 0 | 1 | 0 | 0 | 0 | 0 | 0 |
| 595 | 0 | 0 | 0 | 0 | 0.001 | 0.999 | 0 |
| 596 | 0 | 0 | 0 | 0 | 0.002 | 0.998 | 0 |
| 597 | 0 | 0 | 0.006 | 0 | 0.119 | 0.866 | 0.009 |
| 598 | 0 | 0 | 0.001 | 0 | 0.093 | 0.8 | 0.107 |
| 599 | 0 | 0 | 0 | 0 | 0.011 | 0.988 | 0.001 |
| 600 | 0 | 0 | 0 | 0 | 0.002 | 0.998 | 0 |
| 601 | 0 | 0.013 | 0.004 | 0 | 0.969 | 0.013 | 0 |
| 602 | 0 | 0 | 0 | 0 | 0 | 1 | 0 |
| 603 | 0 | 0 | 0.002 | 0 | 0.002 | 0.996 | 0 |
| 604 | 0 | 0 | 0 | 0 | 0.01 | 0.99 | 0 |
| 605 | 0 | 0 | 0 | 0 | 0.232 | 0.768 | 0 |
| 606 | 0 | 0.001 | 0.003 | 0 | 0.334 | 0.417 | 0.245 |
| 607 | 0 | 0 | 0 | 0 | 0.012 | 0.988 | 0 |
| 608 | 0 | 0 | 0 | 0 | 0.005 | 0.995 | 0 |
| 609 | 0 | 0 | 0 | 0 | 0.004 | 0.996 | 0 |
| 610 | 0 | 0 | 0 | 0 | 0 | 1 | 0 |
| 611 | 0 | 0 | 0 | 0 | 0 | 1 | 0 |
| 612 | 0 | 0 | 0 | 0 | 0.033 | 0.967 | 0 |
| 613 | 0 | 0 | 0 | 0 | 0.733 | 0.234 | 0.032 |
| 614 | 0 | 0 | 0 | 0 | 0.4 | 0.6 | 0 |
| 615 | 0 | 0 | 0 | 0 | 0.005 | 0.995 | 0 |
| 616 | 0 | 0 | 0 | 0 | 0.001 | 0.999 | 0 |
| 617 | 0 | 0 | 0 | 0 | 0.035 | 0.965 | 0 |
| 618 | 0 | 0 | 0 | 0 | 0.012 | 0.988 | 0 |
| 619 | 0 | 0 | 0.001 | 0 | 0.001 | 0.998 | 0 |
| 620 | 0 | 0 | 0.005 | 0 | 0.917 | 0.001 | 0.076 |
| 621 | 0 | 0 | 0 | 0 | 0 | 1 | 0 |
| 622 | 0 | 0 | 0 | 0 | 0.002 | 0.998 | 0 |
| 623 | 0 | 0 | 0 | 0 | 0.132 | 0.868 | 0 |
| 624 | 0 | 0.004 | 0.571 | 0.006 | 0.414 | 0.004 | 0 |
| 625 | 0 | 0 | 0.072 | 0.006 | 0.098 | 0.824 | 0 |
| 626 | 0 | 0 | 0 | 0 | 0 | 1 | 0 |
| 627 | 0 | 0 | 0 | 0 | 0.005 | 0.995 | 0 |
| 628 | 0 | 0 | 0 | 0 | 0.042 | 0.958 | 0 |
| 629 | 0 | 0.062 | 0.041 | 0.002 | 0.093 | 0.802 | 0 |
| 630 | 0 | 0 | 0 | 0 | 0.181 | 0.819 | 0 |
| 631 | 0 | 0 | 0 | 0 | 0 | 1 | 0 |
| 632 | 0 | 0 | 0 | 0 | 0.001 | 0.999 | 0 |
| 633 | 0 | 0 | 0 | 0 | 0 | 1 | 0 |
| 634 | 0 | 0 | 0 | 0 | 0.008 | 0.992 | 0 |
| 635 | 0 | 0 | 0 | 0 | 0.071 | 0.929 | 0 |
| 636 | 0 | 0 | 0 | 0 | 0 | 1 | 0 |
| 637 | 0 | 0 | 0 | 0 | 0.91 | 0.09 | 0 |
| 638 | 0 | 0 | 0 | 0 | 0.005 | 0.995 | 0 |
| 639 | 0 | 0 | 0 | 0 | 0.009 | 0.991 | 0 |
| 640 | 0 | 0 | 0 | 0 | 0.258 | 0.742 | 0 |
| 641 | 0 | 0 | 0 | 0 | 0 | 1 | 0 |
| 642 | 0 | 0 | 0 | 0 | 0.001 | 0.999 | 0 |
| 643 | 0 | 0 | 0 | 0 | 0.027 | 0.973 | 0 |
| 644 | 0 | 0 | 0 | 0 | 0.006 | 0.994 | 0 |
| 645 | 0 | 0 | 0.007 | 0 | 0.047 | 0.946 | 0 |
| 646 | 0 | 0 | 0 | 0 | 0.011 | 0.989 | 0 |
| 647 | 0 | 0.868 | 0 | 0.132 | 0 | 0 | 0 |
| 648 | 0 | 0 | 0 | 0 | 0 | 1 | 0 |
| 649 | 0 | 0 | 0 | 0.001 | 0.379 | 0.618 | 0.001 |
| 650 | 0 | 0 | 0 | 0 | 0.039 | 0.961 | 0 |
| 651 | 0 | 0 | 0 | 0 | 0 | 0.997 | 0.003 |
| 652 | 0 | 0 | 0 | 0 | 0.002 | 0.998 | 0 |
| 653 | 0 | 0 | 0 | 0 | 0.042 | 0.958 | 0 |
| 654 | 0 | 0 | 0.039 | 0.004 | 0.139 | 0.818 | 0 |
| 655 | 0 | 0 | 0 | 0 | 0.008 | 0.992 | 0 |
| 656 | 0 | 0 | 0 | 0 | 0.005 | 0.995 | 0 |
| 657 | 0 | 0 | 0 | 0 | 0.003 | 0.997 | 0 |
| 658 | 0 | 0 | 0 | 0 | 0.028 | 0.97 | 0.002 |
| 659 | 0 | 0 | 0 | 0 | 0.007 | 0.993 | 0 |
| 660 | 0 | 0 | 0 | 0 | 0.003 | 0.997 | 0 |
| 661 | 0 | 0 | 0.035 | 0.004 | 0.003 | 0.958 | 0 |
| 662 | 0 | 0 | 0 | 0 | 0.528 | 0.472 | 0 |
| 663 | 0 | 0 | 0 | 0 | 0.925 | 0.075 | 0 |
| 664 | 0 | 0 | 0.005 | 0.002 | 0.771 | 0.217 | 0.004 |
| 665 | 0 | 0 | 0.001 | 0 | 0.969 | 0.029 | 0.001 |
| 666 | 0 | 0 | 0.002 | 0.002 | 0.77 | 0.227 | 0 |
| 667 | 0 | 0 | 0.004 | 0 | 0.77 | 0.225 | 0 |
| 668 | 0 | 0 | 0 | 0 | 0.263 | 0.671 | 0.066 |
| 669 | 0 | 0 | 0.008 | 0.002 | 0.95 | 0.041 | 0 |
| 670 | 0 | 0 | 0.001 | 0 | 0.969 | 0.029 | 0.001 |
| 671 | 0 | 0 | 0 | 0 | 0.009 | 0.991 | 0 |
| 672 | 0 | 0 | 0.001 | 0 | 0.667 | 0.329 | 0.003 |
| 673 | 0 | 0 | 0.016 | 0.01 | 0.864 | 0.111 | 0 |
| 674 | 0 | 0 | 0.001 | 0 | 0.964 | 0.035 | 0 |
| 675 | 0 | 0 | 0.001 | 0 | 0.957 | 0.042 | 0 |
| 676 | 0 | 0 | 0 | 0 | 0.845 | 0.155 | 0 |
| 677 | 0 | 1 | 0 | 0 | 0 | 0 | 0 |
| 678 | 0 | 0 | 0.004 | 0.002 | 0.912 | 0.08 | 0.002 |
| 679 | 0 | 0 | 0.001 | 0.001 | 0.014 | 0.984 | 0 |
| 680 | 0 | 0 | 0 | 0 | 0.007 | 0.993 | 0 |
| 681 | 0 | 0 | 0 | 0 | 0.004 | 0.996 | 0 |
| 682 | 0 | 0 | 0 | 0 | 0.039 | 0.961 | 0 |
| 683 | 0 | 0 | 0 | 0.003 | 0.808 | 0.188 | 0 |
| 684 | 0 | 0 | 0 | 0 | 0.026 | 0.974 | 0 |
| 685 | 0.024 | 0 | 0.004 | 0 | 0.266 | 0.082 | 0.623 |
| 686 | 0 | 0 | 0 | 0.001 | 0.48 | 0.497 | 0.022 |
| 687 | 0 | 0 | 0 | 0 | 0.975 | 0.025 | 0 |
| 688 | 0 | 0 | 0.003 | 0 | 0.947 | 0.05 | 0 |
| 689 | 0 | 0 | 0.117 | 0.004 | 0.794 | 0.056 | 0.029 |
| 690 | 0 | 0 | 0 | 0 | 0.138 | 0.001 | 0.861 |
| 691 | 0 | 0 | 0 | 0 | 0.504 | 0.373 | 0.123 |
| 692 | 0 | 0 | 0 | 0 | 1 | 0 | 0 |
| 693 | 0 | 0 | 0 | 0 | 0.048 | 0.95 | 0.002 |
| 694 | 0 | 0 | 0.002 | 0 | 0.892 | 0.106 | 0 |
| 695 | 0 | 0 | 0 | 0 | 0.542 | 0.458 | 0 |
| 696 | 0 | 0 | 0 | 0 | 0.96 | 0.039 | 0.001 |
| 697 | 0 | 0 | 0 | 0 | 0.979 | 0.021 | 0 |
| 698 | 0 | 0 | 0.811 | 0.126 | 0.052 | 0.011 | 0 |
| 699 | 0 | 0 | 0 | 0 | 0.903 | 0.097 | 0 |
| 700 | 0 | 0 | 0.002 | 0.012 | 0.702 | 0.282 | 0.002 |
| 701 | 0 | 0 | 0 | 0 | 0.936 | 0.064 | 0 |
| 702 | 0 | 0 | 0 | 0 | 0.997 | 0.003 | 0 |
| 703 | 0 | 0 | 0 | 0 | 0.329 | 0.671 | 0 |
| 704 | 0 | 0 | 0.001 | 0 | 0.775 | 0 | 0.223 |
| 705 | 0 | 0 | 0 | 0 | 0.915 | 0.085 | 0 |
| 706 | 0 | 0 | 0 | 0 | 0.984 | 0.007 | 0.009 |
| 707 | 0 | 0 | 0 | 0 | 0.601 | 0.395 | 0.004 |
| 708 | 0 | 0 | 0 | 0 | 0.936 | 0.064 | 0 |
| 709 | 0 | 0 | 0 | 0 | 0.627 | 0.373 | 0 |
| 710 | 0 | 0 | 0 | 0 | 0.948 | 0.05 | 0.001 |
| 711 | 0 | 0 | 0 | 0 | 0.834 | 0.166 | 0 |
| 712 | 0 | 0.019 | 0.143 | 0.395 | 0.205 | 0.237 | 0.001 |
| 713 | 0 | 0 | 0 | 0 | 0.991 | 0.009 | 0 |
| 714 | 0 | 0 | 0 | 0 | 0.157 | 0.843 | 0 |
| 715 | 0 | 0 | 0 | 0 | 0.062 | 0.938 | 0 |
| 716 | 0 | 0.001 | 0.004 | 0.003 | 0.885 | 0.107 | 0 |
| 717 | 0 | 0 | 0 | 0 | 0.728 | 0.272 | 0 |
| 718 | 0 | 0 | 0 | 0 | 0.64 | 0.36 | 0 |
| 719 | 0 | 0 | 0.003 | 0 | 0.996 | 0.001 | 0 |
| 720 | 0 | 0 | 0.001 | 0 | 0.764 | 0.235 | 0 |
| 721 | 0 | 0 | 0 | 0 | 0.73 | 0.206 | 0.064 |
| 722 | 0 | 0 | 0 | 0 | 0.402 | 0.598 | 0 |
| 723 | 0 | 0 | 0.001 | 0 | 0.047 | 0.942 | 0.01 |
| 724 | 0 | 0 | 0 | 0 | 0.842 | 0.158 | 0 |
| 725 | 0 | 0 | 0 | 0 | 1 | 0 | 0 |
| 726 | 0 | 0 | 0 | 0 | 0.998 | 0 | 0.002 |
| 727 | 0 | 0 | 0 | 0.003 | 0.087 | 0.909 | 0.001 |
| 728 | 0 | 0 | 0 | 0 | 0.475 | 0.525 | 0 |
| 729 | 0 | 0 | 0.017 | 0 | 0.528 | 0.453 | 0.001 |
| 730 | 0 | 0 | 0.021 | 0 | 0.974 | 0.004 | 0 |
| 731 | 0 | 0 | 0 | 0 | 0 | 1 | 0 |
| 732 | 0 | 0 | 0 | 0 | 0.132 | 0.868 | 0 |
| 733 | 0 | 0 | 0 | 0 | 0.596 | 0.404 | 0 |
| 734 | 0 | 0.515 | 0.014 | 0.042 | 0.429 | 0 | 0 |
| 735 | 0 | 1 | 0 | 0 | 0 | 0 | 0 |
| 736 | 0 | 0 | 0 | 0 | 0.616 | 0.358 | 0.026 |
| 737 | 0 | 1 | 0 | 0 | 0 | 0 | 0 |
| 738 | 0 | 0 | 0.001 | 0 | 0.332 | 0.668 | 0 |
| 739 | 0 | 0.002 | 0.066 | 0.002 | 0.929 | 0.002 | 0 |
| 740 | 0 | 0.004 | 0.53 | 0.139 | 0.326 | 0.002 | 0 |
| 741 | 0 | 0 | 0 | 0 | 0.949 | 0.051 | 0 |
| 742 | 0 | 0.999 | 0.001 | 0 | 0 | 0 | 0 |
| 743 | 0 | 0.001 | 0.013 | 0 | 0.984 | 0.002 | 0 |
| 744 | 0 | 0.004 | 0.841 | 0.068 | 0.088 | 0 | 0 |
| 745 | 0 | 0.472 | 0.116 | 0.272 | 0.134 | 0.006 | 0.001 |
| 746 | 0 | 0.285 | 0.014 | 0.009 | 0.688 | 0.005 | 0 |
| 747 | 0 | 0 | 0.092 | 0.006 | 0.894 | 0.008 | 0 |
| 748 | 0 | 0 | 0 | 0 | 0.871 | 0.018 | 0.111 |
| 749 | 0 | 0 | 0 | 0 | 0.805 | 0.193 | 0.002 |
| 750 | 0 | 0.879 | 0.01 | 0.002 | 0.108 | 0 | 0 |
| 751 | 0 | 0 | 0 | 0 | 0.672 | 0.001 | 0.327 |
| 752 | 0 | 0 | 0 | 0 | 0.59 | 0.387 | 0.023 |
| 753 | 0 | 1 | 0 | 0 | 0 | 0 | 0 |
| 754 | 0 | 0 | 0 | 0 | 0.998 | 0.002 | 0 |
| 755 | 0 | 0 | 0 | 0 | 1 | 0 | 0 |
| 756 | 0 | 0 | 0 | 0 | 0.966 | 0.034 | 0 |
| 757 | 0 | 0 | 0.003 | 0 | 0.996 | 0 | 0.001 |
| 758 | 0 | 0 | 0 | 0 | 0.943 | 0.057 | 0 |
| 759 | 0 | 0 | 0 | 0 | 1 | 0 | 0 |
| 760 | 0 | 0.001 | 0 | 0 | 0.999 | 0 | 0 |
| 761 | 0 | 0 | 0 | 0 | 0.858 | 0 | 0.142 |
| 762 | 0 | 0 | 0 | 0.058 | 0.935 | 0.007 | 0 |
| 763 | 0 | 0 | 0 | 0 | 0.964 | 0.036 | 0 |
| 764 | 0 | 0 | 0.01 | 0 | 0.99 | 0 | 0 |
| 765 | 0 | 0 | 0 | 0 | 0.951 | 0.049 | 0 |
| 766 | 0 | 0 | 0 | 0 | 1 | 0 | 0 |
| 767 | 0 | 0 | 0 | 0 | 1 | 0 | 0 |
| 768 | 0 | 0 | 0 | 0 | 0.956 | 0.034 | 0.01 |
| 769 | 0 | 0 | 0.047 | 0.033 | 0.153 | 0.762 | 0.005 |
| 770 | 0 | 0 | 0 | 0 | 0.994 | 0.006 | 0 |
| 771 | 0 | 0 | 0 | 0 | 0.995 | 0.005 | 0 |
| 772 | 0 | 0 | 0 | 0 | 0.982 | 0 | 0.018 |
| 773 | 0 | 0 | 0.015 | 0 | 0.667 | 0.013 | 0.305 |
| 774 | 0 | 0 | 0 | 0 | 1 | 0 | 0 |
| 775 | 0 | 0 | 0 | 0 | 1 | 0 | 0 |
| 776 | 0 | 0 | 0 | 0 | 1 | 0 | 0 |
| 777 | 0 | 0 | 0 | 0 | 0.999 | 0.001 | 0 |
| 778 | 0 | 0 | 0 | 0 | 0.855 | 0.145 | 0 |
| 779 | 0 | 0 | 0.007 | 0 | 0.969 | 0.021 | 0.003 |
| 780 | 0 | 0 | 0 | 0 | 0.989 | 0.009 | 0.002 |
| 781 | 0 | 0.77 | 0.01 | 0.05 | 0.17 | 0 | 0 |
| 782 | 0 | 0.006 | 0.003 | 0.039 | 0.941 | 0.01 | 0.001 |
| 783 | 0 | 0 | 0 | 0 | 0.986 | 0.014 | 0 |
| 784 | 0 | 0 | 0.001 | 0 | 0.977 | 0 | 0.022 |
| 785 | 0 | 0.001 | 0 | 0.001 | 0.391 | 0.607 | 0 |
| 786 | 0 | 0.644 | 0.002 | 0 | 0.298 | 0.002 | 0.054 |
| 787 | 0 | 0 | 0 | 0 | 0.028 | 0.025 | 0.948 |
| 788 | 0 | 0.001 | 0.001 | 0 | 0.997 | 0.002 | 0 |
| 789 | 0 | 0 | 0 | 0 | 0.99 | 0.002 | 0.008 |
| 790 | 0 | 0 | 0 | 0 | 0.986 | 0.012 | 0.002 |
| 791 | 0 | 0.003 | 0 | 0 | 0.993 | 0.004 | 0 |
| 792 | 0 | 0 | 0 | 0 | 0.996 | 0.004 | 0 |
| 793 | 0 | 0 | 0 | 0 | 0.997 | 0.003 | 0 |
| 794 | 0 | 0 | 0.075 | 0 | 0.923 | 0.001 | 0 |
| 795 | 0 | 0 | 0.002 | 0 | 0.734 | 0.262 | 0.003 |
| 796 | 0 | 0.014 | 0.001 | 0 | 0.986 | 0 | 0 |
| 797 | 0 | 0 | 0 | 0 | 0.974 | 0.026 | 0 |
| 798 | 0 | 0 | 0 | 0 | 0.094 | 0.906 | 0 |
| 799 | 0 | 0.001 | 0 | 0 | 0.998 | 0.001 | 0 |
| 800 | 0 | 0 | 0 | 0 | 0.999 | 0.001 | 0 |
| 801 | 0 | 0 | 0.509 | 0.009 | 0.252 | 0.112 | 0.119 |
| 802 | 0 | 0.918 | 0.004 | 0.078 | 0 | 0 | 0 |
| 803 | 0 | 0 | 0 | 0 | 0.274 | 0.726 | 0 |
| 804 | 0 | 0 | 0.003 | 0 | 0.978 | 0.018 | 0.001 |
| 805 | 0 | 0 | 0.001 | 0 | 0.601 | 0.398 | 0 |
| 806 | 0 | 0 | 0.001 | 0 | 0.214 | 0.785 | 0 |
| 807 | 0 | 0 | 0.023 | 0.021 | 0.396 | 0.53 | 0.03 |
| 808 | 0 | 0 | 0 | 0 | 0.666 | 0.329 | 0.004 |
| 809 | 0 | 0 | 0.033 | 0.001 | 0.052 | 0.914 | 0 |
| 810 | 0 | 0.051 | 0.461 | 0.065 | 0.272 | 0.075 | 0.076 |
| 811 | 0 | 0 | 0 | 0 | 0.646 | 0.354 | 0 |
| 812 | 0 | 0 | 0 | 0 | 0.904 | 0.077 | 0.019 |
| 813 | 0 | 0 | 0.048 | 0.011 | 0.726 | 0.214 | 0.001 |
| 814 | 0 | 0 | 0.004 | 0 | 0.913 | 0.084 | 0 |
| 815 | 0 | 0 | 0 | 0 | 0.998 | 0.002 | 0 |
| 816 | 0 | 0 | 0.001 | 0 | 0.424 | 0.575 | 0 |
| 817 | 0 | 1 | 0 | 0 | 0 | 0 | 0 |
| 818 | 0 | 0.003 | 0 | 0 | 0.1 | 0.897 | 0 |
| 819 | 0 | 0.999 | 0.001 | 0 | 0 | 0 | 0 |
| 820 | 0 | 0 | 0 | 0 | 0.031 | 0.969 | 0 |
| 821 | 0 | 0 | 0.29 | 0.002 | 0.439 | 0.269 | 0 |
| 822 | 0 | 0 | 0.005 | 0 | 0.918 | 0.054 | 0.022 |
| 823 | 0 | 0.002 | 0 | 0 | 0.554 | 0.444 | 0 |
| 824 | 0 | 0 | 0.005 | 0 | 0.629 | 0.367 | 0 |
| 825 | 0 | 0 | 0 | 0 | 0.002 | 0 | 0.998 |
| 826 | 0 | 0 | 0.001 | 0 | 0.004 | 0.995 | 0 |
| 827 | 0 | 0.386 | 0 | 0.001 | 0.592 | 0.016 | 0.005 |
| 828 | 0 | 0 | 0.693 | 0.007 | 0.269 | 0.031 | 0 |
| 829 | 0 | 0 | 0 | 0 | 0.99 | 0.01 | 0 |
| 830 | 0 | 0 | 0.003 | 0.008 | 0.72 | 0.266 | 0.002 |
| 831 | 0 | 0 | 0 | 0 | 0.987 | 0.013 | 0 |
| 832 | 0 | 0.002 | 0.076 | 0 | 0.903 | 0.019 | 0 |
| 833 | 0 | 0 | 0 | 0 | 0 | 0 | 1 |
| 834 | 0 | 0 | 0 | 0 | 0.929 | 0.062 | 0.01 |
| 835 | 0 | 0 | 0.077 | 0.001 | 0.866 | 0.039 | 0.017 |
| 836 | 0 | 0 | 0 | 0 | 0 | 0 | 1 |
| 837 | 0 | 0 | 0 | 0 | 0 | 0 | 1 |
| 838 | 0 | 0 | 0 | 0 | 0.001 | 0.999 | 0 |
| 839 | 0 | 0 | 0 | 0 | 0.449 | 0.551 | 0 |
| 840 | 0 | 0 | 0 | 0 | 0.386 | 0.61 | 0.004 |
| 841 | 0 | 0 | 0.001 | 0 | 0.956 | 0.04 | 0.002 |
| 842 | 0 | 0 | 0 | 0 | 0.648 | 0.342 | 0.01 |
| 843 | 0 | 0 | 0 | 0.001 | 0.936 | 0.058 | 0.006 |
| 844 | 0 | 0 | 0 | 0 | 0.58 | 0.42 | 0 |
| 845 | 0 | 0 | 0 | 0 | 0.615 | 0.384 | 0.001 |
| 846 | 0 | 0 | 0 | 0 | 0.989 | 0.011 | 0 |
| 847 | 0 | 0 | 0 | 0 | 0.414 | 0.008 | 0.577 |
| 848 | 0 | 0 | 0.001 | 0.001 | 0.476 | 0.52 | 0.001 |
| 849 | 0 | 0 | 0 | 0 | 0.751 | 0.248 | 0.001 |
| 850 | 0 | 0 | 0 | 0 | 0.813 | 0.186 | 0.002 |
| 851 | 0 | 0 | 0.001 | 0 | 0.896 | 0.104 | 0 |
| 852 | 0 | 0.009 | 0.011 | 0.013 | 0.558 | 0.41 | 0 |
| 853 | 0 | 0 | 0.003 | 0.003 | 0.896 | 0.02 | 0.078 |
| 854 | 0 | 0 | 0 | 0 | 0.35 | 0.368 | 0.282 |
| 855 | 0 | 0 | 0 | 0 | 0.908 | 0.092 | 0 |
| 856 | 0 | 0 | 0 | 0 | 0.99 | 0.01 | 0 |
| 857 | 0 | 0 | 0 | 0 | 0.646 | 0.354 | 0 |
| 858 | 0 | 0 | 0 | 0 | 0.953 | 0.047 | 0 |
| 859 | 0 | 0 | 0 | 0 | 0.7 | 0.274 | 0.026 |
| 860 | 0 | 0 | 0 | 0 | 0.46 | 0.457 | 0.083 |
| 861 | 0 | 0 | 0 | 0 | 0.991 | 0.009 | 0 |
| 862 | 0 | 0 | 0 | 0 | 0.021 | 0.164 | 0.815 |
| 863 | 0 | 0 | 0 | 0 | 0 | 0 | 1 |
| 864 | 0 | 0.893 | 0.004 | 0.103 | 0 | 0 | 0 |
| 865 | 0 | 0.995 | 0.005 | 0 | 0 | 0 | 0 |
| 866 | 0 | 0.999 | 0.001 | 0 | 0 | 0 | 0 |
| 867 | 0 | 1 | 0 | 0 | 0 | 0 | 0 |
| 868 | 0 | 1 | 0 | 0 | 0 | 0 | 0 |
| 869 | 0 | 1 | 0 | 0 | 0 | 0 | 0 |
| 870 | 0 | 1 | 0 | 0 | 0 | 0 | 0 |
| 871 | 0 | 0.999 | 0 | 0.001 | 0 | 0 | 0 |
| 872 | 0 | 1 | 0 | 0 | 0 | 0 | 0 |
| 873 | 0 | 0.996 | 0.004 | 0 | 0 | 0 | 0 |
| 874 | 0 | 1 | 0 | 0 | 0 | 0 | 0 |
| 875 | 0 | 1 | 0 | 0 | 0 | 0 | 0 |
| 876 | 0 | 1 | 0 | 0 | 0 | 0 | 0 |
| 877 | 0 | 1 | 0 | 0 | 0 | 0 | 0 |
| 878 | 0.041 | 0.956 | 0.003 | 0.001 | 0 | 0 | 0 |
| 879 | 0 | 0.988 | 0.005 | 0.006 | 0.001 | 0 | 0 |
| 880 | 0 | 1 | 0 | 0 | 0 | 0 | 0 |
| 881 | 0 | 0.999 | 0 | 0.001 | 0 | 0 | 0 |
| 882 | 0 | 1 | 0 | 0 | 0 | 0 | 0 |
| 883 | 0 | 1 | 0 | 0 | 0 | 0 | 0 |
| 884 | 0 | 1 | 0 | 0 | 0 | 0 | 0 |
| 885 | 0 | 1 | 0 | 0 | 0 | 0 | 0 |
| 886 | 0 | 1 | 0 | 0 | 0 | 0 | 0 |
| 887 | 0.001 | 0.859 | 0.005 | 0.113 | 0.003 | 0 | 0.019 |
| 888 | 0 | 0 | 0.139 | 0.861 | 0 | 0 | 0 |
| 889 | 0 | 0 | 0.139 | 0.861 | 0 | 0 | 0 |
| 890 | 0 | 0.788 | 0 | 0.212 | 0 | 0 | 0 |
| 891 | 0 | 0.997 | 0 | 0 | 0.003 | 0 | 0 |
| 892 | 0 | 0.007 | 0 | 0.991 | 0.002 | 0 | 0 |
| 893 | 0 | 0.049 | 0.184 | 0.76 | 0 | 0.007 | 0 |
| 894 | 0 | 0.006 | 0.002 | 0.992 | 0 | 0 | 0 |
| 895 | 0 | 0 | 0.139 | 0.861 | 0 | 0 | 0 |
| 896 | 0 | 0 | 0.139 | 0.861 | 0 | 0 | 0 |
| 897 | 0 | 0 | 0.139 | 0.861 | 0 | 0 | 0 |
| 898 | 0 | 0 | 0.139 | 0.861 | 0 | 0 | 0 |
| 899 | 0 | 0.521 | 0.004 | 0.474 | 0.002 | 0 | 0 |
| 900 | 0 | 0 | 0 | 0.999 | 0 | 0 | 0 |
| 901 | 0 | 0.01 | 0.838 | 0.152 | 0 | 0 | 0 |
| 902 | 0.002 | 0.993 | 0.002 | 0 | 0.003 | 0 | 0 |
| 903 | 0 | 0.994 | 0.004 | 0 | 0.001 | 0 | 0 |
| 904 | 0 | 0 | 0.139 | 0.861 | 0 | 0 | 0 |
| 905 | 0 | 0.022 | 0.042 | 0.017 | 0.523 | 0.394 | 0.002 |
| 906 | 0 | 0.02 | 0.014 | 0.965 | 0 | 0 | 0 |
| 907 | 0 | 0.977 | 0 | 0.023 | 0 | 0 | 0 |
| 908 | 0 | 0 | 0.139 | 0.861 | 0 | 0 | 0 |
| 909 | 0 | 0 | 0.139 | 0.861 | 0 | 0 | 0 |
| 910 | 0 | 0 | 0.139 | 0.861 | 0 | 0 | 0 |
| 911 | 0 | 0.001 | 0.004 | 0.002 | 0.002 | 0.992 | 0 |
| 912 | 0 | 0.999 | 0 | 0.001 | 0 | 0 | 0 |
| 913 | 0 | 1 | 0 | 0 | 0 | 0 | 0 |
| 914 | 0.001 | 0.999 | 0 | 0 | 0 | 0 | 0 |
| 915 | 0 | 0.998 | 0.001 | 0.002 | 0 | 0 | 0 |
| 916 | 0 | 0.998 | 0 | 0.002 | 0 | 0 | 0 |
| 917 | 0 | 0.997 | 0.003 | 0 | 0 | 0 | 0 |
| 918 | 0 | 0.997 | 0.002 | 0.001 | 0 | 0 | 0 |
| 919 | 0.001 | 0.999 | 0 | 0 | 0 | 0 | 0 |
| 920 | 0 | 1 | 0 | 0 | 0 | 0 | 0 |
| 921 | 0 | 0.32 | 0.28 | 0.401 | 0 | 0 | 0 |
| 922 | 0.006 | 0.994 | 0 | 0 | 0 | 0 | 0 |
| 923 | 0 | 1 | 0 | 0 | 0 | 0 | 0 |
| 924 | 0 | 0.962 | 0.014 | 0.024 | 0 | 0 | 0 |
| 925 | 0 | 0.999 | 0 | 0.001 | 0 | 0 | 0 |
| 926 | 0 | 0.002 | 0.844 | 0.123 | 0.01 | 0.02 | 0 |
| 927 | 0 | 0.996 | 0 | 0.004 | 0 | 0 | 0 |
| 928 | 0 | 0.999 | 0.001 | 0 | 0 | 0 | 0 |
| 929 | 0 | 1 | 0 | 0 | 0 | 0 | 0 |
| 930 | 0 | 0.991 | 0 | 0.001 | 0.007 | 0 | 0 |
| 931 | 0 | 0.999 | 0 | 0.001 | 0 | 0 | 0 |
| 932 | 0 | 0.914 | 0.002 | 0.002 | 0.082 | 0 | 0 |
| 933 | 0 | 0.997 | 0 | 0.003 | 0 | 0 | 0 |
| 934 | 0 | 0.004 | 0.072 | 0.056 | 0.732 | 0.135 | 0.001 |
| 935 | 0 | 0 | 0 | 0 | 0.006 | 0.994 | 0 |
| 936 | 0 | 0 | 0 | 0 | 0.003 | 0.997 | 0 |
| 937 | 0 | 0.002 | 0.001 | 0.002 | 0.015 | 0.98 | 0 |
| 938 | 0 | 0 | 0.001 | 0 | 0.112 | 0.888 | 0 |
| 939 | 0 | 0 | 0 | 0 | 0 | 1 | 0 |
| 940 | 0 | 0 | 0 | 0 | 0 | 1 | 0 |
| 941 | 0 | 0 | 0.687 | 0.038 | 0.172 | 0.102 | 0 |
| 942 | 0 | 0 | 0 | 0 | 0.002 | 0.998 | 0 |
| 943 | 0 | 0 | 0.002 | 0 | 0.058 | 0.94 | 0 |
| 944 | 0 | 0.998 | 0.002 | 0.001 | 0 | 0 | 0 |
| 945 | 0 | 0 | 0.003 | 0 | 0.049 | 0.948 | 0 |
| 946 | 0 | 0.14 | 0.05 | 0.65 | 0.156 | 0.005 | 0 |
| 947 | 0 | 1 | 0 | 0 | 0 | 0 | 0 |
| 948 | 0 | 1 | 0 | 0 | 0 | 0 | 0 |
| 949 | 0 | 0.001 | 0.003 | 0 | 0.154 | 0.843 | 0 |
| 950 | 0 | 0 | 0 | 0 | 0 | 0.999 | 0.001 |
| 951 | 0 | 0 | 0 | 0 | 0.006 | 0.994 | 0 |
| 952 | 0 | 0.43 | 0.015 | 0.517 | 0.033 | 0.004 | 0.001 |
| 953 | 0 | 0.001 | 0.003 | 0 | 0.478 | 0.509 | 0.009 |
| 954 | 0 | 0 | 0 | 0 | 0.045 | 0.955 | 0 |
| 955 | 0 | 0 | 0 | 0 | 0.074 | 0.926 | 0 |
| 956 | 0 | 0 | 0 | 0 | 0.003 | 0.997 | 0 |
| 957 | 0 | 0 | 0 | 0 | 0.76 | 0.23 | 0.01 |
| 958 | 0 | 0.967 | 0 | 0 | 0.033 | 0 | 0 |
| 959 | 0 | 0 | 0 | 0 | 0 | 0 | 1 |
| 960 | 0 | 0 | 0 | 0 | 0 | 0 | 1 |
| 961 | 0 | 0 | 0 | 0 | 0 | 0 | 1 |
| 962 | 0 | 0 | 0 | 0.002 | 0 | 0.002 | 0.996 |
| 963 | 0 | 0 | 0 | 0 | 0 | 0 | 1 |
| 964 | 0 | 0 | 0 | 0 | 0 | 0 | 1 |
| 965 | 0 | 0 | 0 | 0 | 0 | 0 | 1 |
| 966 | 0 | 0 | 0 | 0.001 | 0 | 0 | 0.999 |
| 967 | 0 | 0 | 0 | 0 | 0 | 0 | 1 |
| 968 | 0 | 0 | 0 | 0 | 0 | 0 | 1 |
| 969 | 0 | 0 | 0 | 0 | 0 | 0 | 1 |
| 970 | 0 | 0 | 0 | 0 | 0.437 | 0.027 | 0.537 |
| 971 | 0 | 0 | 0 | 0.002 | 0.002 | 0 | 0.996 |
| 972 | 0 | 0 | 0 | 0 | 0 | 0 | 1 |
| 973 | 0 | 0 | 0 | 0 | 0 | 0 | 1 |
| 974 | 0 | 0 | 0 | 0 | 0 | 0 | 1 |
| 975 | 0 | 0 | 0 | 0 | 0 | 0 | 1 |
| 976 | 0 | 0 | 0 | 0 | 0 | 0 | 1 |
| 977 | 0 | 0 | 0 | 0 | 0.001 | 0 | 0.999 |
| 978 | 0 | 0 | 0 | 0 | 0 | 0 | 1 |
| 979 | 0 | 0 | 0 | 0 | 0 | 0 | 1 |
| 980 | 0 | 0 | 0 | 0 | 0 | 0 | 1 |
| 981 | 0 | 0 | 0 | 0 | 0 | 0 | 1 |
| 982 | 0 | 0 | 0 | 0 | 0.007 | 0.992 | 0.001 |
| 983 | 0 | 0 | 0 | 0 | 0.002 | 0 | 0.998 |
| 984 | 0 | 0 | 0 | 0 | 0 | 0 | 1 |
| 985 | 0 | 0 | 0 | 0 | 0 | 0 | 1 |
| 986 | 0 | 0 | 0 | 0 | 0 | 0 | 1 |
| 987 | 0 | 0 | 0 | 0 | 0 | 0 | 1 |
| 988 | 0 | 0 | 0 | 0 | 0.001 | 0 | 0.999 |
| 989 | 0 | 0 | 0 | 0 | 0 | 0 | 1 |
| 990 | 0 | 0 | 0 | 0 | 0 | 0 | 1 |
| 991 | 0 | 0 | 0 | 0 | 0 | 0 | 1 |
| 992 | 0 | 0 | 0 | 0 | 0.001 | 0 | 0.999 |
| 993 | 0 | 0 | 0 | 0 | 0.169 | 0 | 0.831 |
| 994 | 0 | 0 | 0 | 0 | 0.025 | 0 | 0.975 |
| 995 | 0 | 0 | 0 | 0 | 0 | 0 | 1 |
| 996 | 0 | 0 | 0 | 0 | 0 | 0 | 1 |
| 997 | 0 | 0 | 0 | 0 | 0 | 0 | 1 |
| 998 | 0 | 0 | 0 | 0 | 0.033 | 0.01 | 0.957 |
| 999 | 0 | 0 | 0 | 0 | 0.057 | 0 | 0.943 |
| 1000 | 0 | 0 | 0 | 0 | 0 | 0 | 1 |
| 1001 | 0 | 0 | 0 | 0 | 0 | 0 | 1 |
| 1002 | 0 | 0 | 0 | 0 | 0 | 0 | 1 |
| 1003 | 0 | 0 | 0 | 0 | 0.008 | 0 | 0.992 |
| 1004 | 0 | 0 | 0 | 0 | 0 | 0 | 1 |
| 1005 | 0 | 0 | 0 | 0 | 0 | 0 | 1 |
| 1006 | 0 | 0 | 0 | 0 | 0 | 0 | 1 |
| 1007 | 0 | 0 | 0 | 0.001 | 0.143 | 0 | 0.856 |
| 1008 | 0 | 0 | 0 | 0 | 0 | 0 | 1 |
| 1009 | 0 | 0 | 0.149 | 0.012 | 0.314 | 0.001 | 0.524 |
| 1010 | 0 | 0 | 0 | 0 | 0.008 | 0.018 | 0.974 |
| 1011 | 0 | 0 | 0.001 | 0 | 0.003 | 0 | 0.996 |
| 1012 | 0 | 0 | 0 | 0 | 0 | 0 | 1 |
| 1013 | 0 | 0 | 0 | 0 | 0 | 0 | 1 |
| 1014 | 0 | 0 | 0.028 | 0.029 | 0.005 | 0 | 0.938 |
| 1015 | 0 | 0 | 0 | 0 | 0 | 0 | 1 |
| 1016 | 0 | 0 | 0 | 0 | 0 | 0 | 1 |
| 1017 | 0 | 0 | 0 | 0 | 0 | 0 | 1 |
| 1018 | 0 | 0 | 0 | 0 | 0 | 0 | 1 |
| 1019 | 0 | 0 | 0 | 0 | 0 | 0 | 1 |
| 1020 | 0 | 0 | 0 | 0 | 0.001 | 0 | 0.999 |
| 1021 | 0 | 0 | 0 | 0 | 0.004 | 0.001 | 0.995 |
| 1022 | 0 | 0 | 0 | 0 | 0 | 0 | 1 |
| 1023 | 0 | 0 | 0 | 0 | 0 | 0 | 1 |
| 1024 | 0 | 0 | 0 | 0 | 0.048 | 0 | 0.952 |
| 1025 | 0 | 0 | 0 | 0 | 0 | 0 | 1 |
| 1026 | 0 | 0 | 0.578 | 0.104 | 0.228 | 0.09 | 0 |